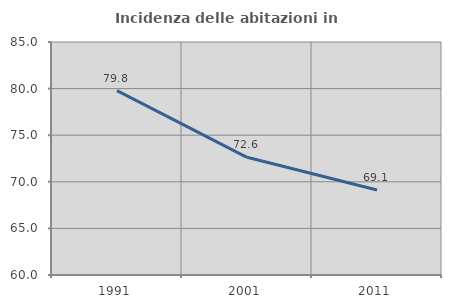
| Category | Incidenza delle abitazioni in proprietà  |
|---|---|
| 1991.0 | 79.785 |
| 2001.0 | 72.626 |
| 2011.0 | 69.128 |